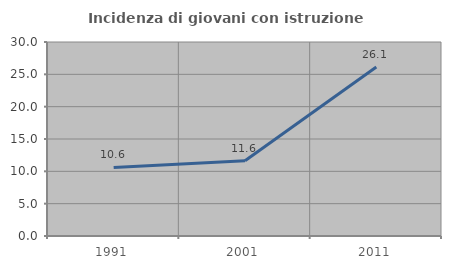
| Category | Incidenza di giovani con istruzione universitaria |
|---|---|
| 1991.0 | 10.596 |
| 2001.0 | 11.628 |
| 2011.0 | 26.144 |